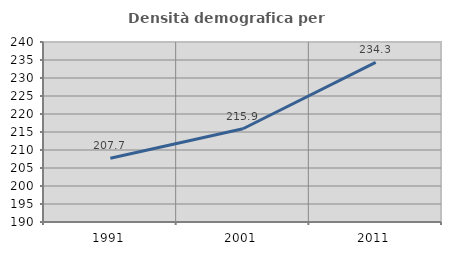
| Category | Densità demografica |
|---|---|
| 1991.0 | 207.717 |
| 2001.0 | 215.896 |
| 2011.0 | 234.317 |